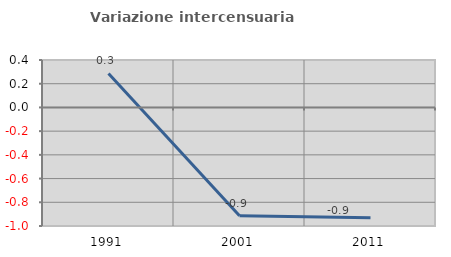
| Category | Variazione intercensuaria annua |
|---|---|
| 1991.0 | 0.287 |
| 2001.0 | -0.913 |
| 2011.0 | -0.931 |